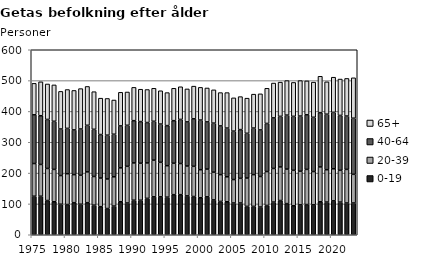
| Category | 0-19 | 20-39 | 40-64 | 65+ |
|---|---|---|---|---|
| 1975.0 | 125 | 106 | 158 | 102 |
| 1976.0 | 125 | 103 | 158 | 110 |
| 1977.0 | 111 | 104 | 159 | 115 |
| 1978.0 | 107 | 105 | 156 | 118 |
| 1979.0 | 99 | 93 | 151 | 122 |
| 1980.0 | 98 | 100 | 147 | 126 |
| 1981.0 | 104 | 91 | 145 | 128 |
| 1982.0 | 99 | 94 | 150 | 131 |
| 1983.0 | 104 | 100 | 151 | 126 |
| 1984.0 | 96 | 93 | 153 | 122 |
| 1985.0 | 91 | 93 | 141 | 118 |
| 1986.0 | 85 | 96 | 142 | 119 |
| 1987.0 | 93 | 95 | 138 | 111 |
| 1988.0 | 107 | 110 | 136 | 109 |
| 1989.0 | 103 | 119 | 133 | 108 |
| 1990.0 | 112 | 121 | 137 | 108 |
| 1991.0 | 112 | 120 | 135 | 105 |
| 1992.0 | 118 | 115 | 131 | 107 |
| 1993.0 | 123 | 119 | 126 | 107 |
| 1994.0 | 123 | 112 | 124 | 108 |
| 1995.0 | 122 | 102 | 130 | 107 |
| 1996.0 | 130 | 102 | 138 | 105 |
| 1997.0 | 130 | 101 | 143 | 106 |
| 1998.0 | 126 | 97 | 143 | 107 |
| 1999.0 | 124 | 98 | 154 | 106 |
| 2000.0 | 120 | 91 | 161 | 106 |
| 2001.0 | 123 | 90 | 153 | 110 |
| 2002.0 | 113 | 90 | 159 | 108 |
| 2003.0 | 108 | 87 | 158 | 108 |
| 2004.0 | 107 | 81 | 158 | 115 |
| 2005.0 | 103 | 76 | 157 | 108 |
| 2006.0 | 103 | 80 | 158 | 107 |
| 2007.0 | 92 | 92 | 145 | 114 |
| 2008.0 | 92 | 103 | 151 | 110 |
| 2009.0 | 90 | 99 | 151 | 117 |
| 2010.0 | 95 | 110 | 156 | 114 |
| 2011.0 | 106 | 109 | 164 | 113 |
| 2012.0 | 111 | 109 | 164 | 111 |
| 2013.0 | 101 | 112 | 175 | 112 |
| 2014.0 | 94 | 115 | 175 | 110 |
| 2015.0 | 97 | 109 | 179 | 115 |
| 2016.0 | 98 | 114 | 177 | 110 |
| 2017.0 | 97 | 108 | 176 | 114 |
| 2018.0 | 107 | 113 | 176 | 118 |
| 2019.0 | 106 | 105 | 180 | 105 |
| 2020.0 | 110 | 104 | 183 | 114 |
| 2021.0 | 106 | 103 | 178 | 118 |
| 2022.0 | 103 | 109 | 173 | 122 |
| 2023.0 | 103 | 93 | 182 | 131 |